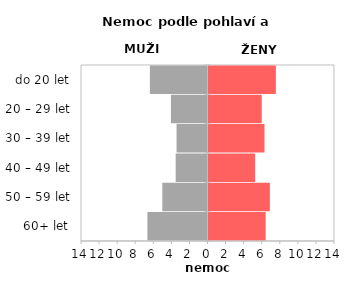
| Category | Nemoc |
|---|---|
| 60+ let | 6.33 |
| 50 – 59 let | 6.79 |
| 40 – 49 let | 5.168 |
| 30 – 39 let | 6.195 |
| 20 – 29 let | 5.89 |
| do 20 let | 7.454 |